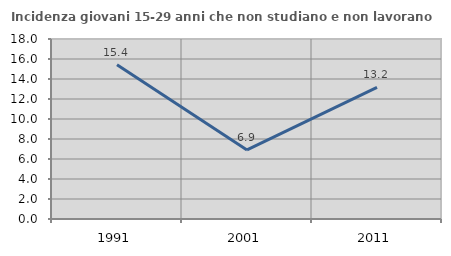
| Category | Incidenza giovani 15-29 anni che non studiano e non lavorano  |
|---|---|
| 1991.0 | 15.432 |
| 2001.0 | 6.908 |
| 2011.0 | 13.171 |